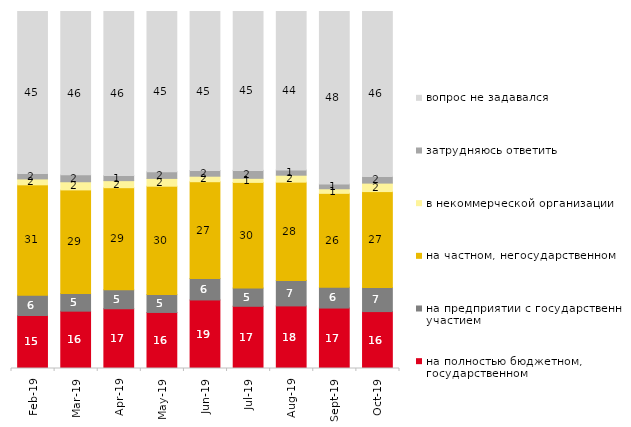
| Category | на полностью бюджетном, государственном | на предприятии с государственным участием | на частном, негосударственном | в некоммерческой организации | затрудняюсь ответить | вопрос не задавался |
|---|---|---|---|---|---|---|
| 2019-02-01 | 14.85 | 5.7 | 30.9 | 1.65 | 1.55 | 45.35 |
| 2019-03-01 | 16.062 | 4.923 | 29.04 | 2.287 | 1.939 | 45.748 |
| 2019-04-01 | 16.733 | 5.297 | 28.614 | 1.98 | 1.436 | 45.941 |
| 2019-05-01 | 15.701 | 5.002 | 30.362 | 2.179 | 1.882 | 44.874 |
| 2019-06-01 | 19.202 | 5.985 | 27.132 | 1.546 | 1.596 | 44.539 |
| 2019-07-01 | 17.426 | 5.099 | 29.604 | 1.139 | 2.228 | 44.505 |
| 2019-08-01 | 17.532 | 7.143 | 27.522 | 1.948 | 1.449 | 44.406 |
| 2019-09-01 | 16.931 | 5.842 | 26.287 | 1.287 | 1.337 | 48.317 |
| 2019-10-01 | 15.941 | 6.733 | 26.881 | 2.376 | 1.881 | 46.188 |